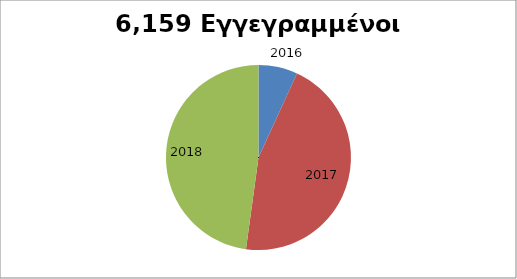
| Category | Series 0 |
|---|---|
| 2016.0 | 421 |
| 2017.0 | 2792 |
| 2018.0 | 2946 |